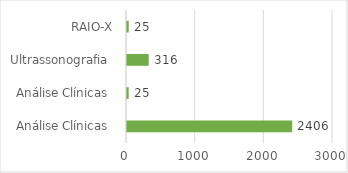
| Category | Series 0 |
|---|---|
| Análise Clínicas  | 2406 |
| Análise Clínicas  | 25 |
| Ultrassonografia  | 316 |
| RAIO-X | 25 |